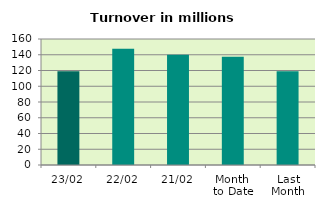
| Category | Series 0 |
|---|---|
| 23/02 | 119.073 |
| 22/02 | 147.763 |
| 21/02 | 139.935 |
| Month 
to Date | 137.392 |
| Last
Month | 119.055 |